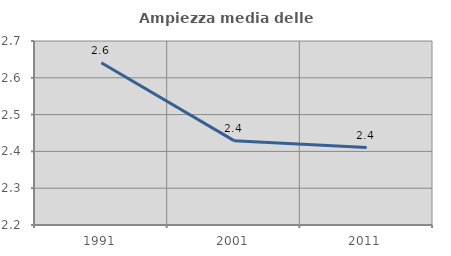
| Category | Ampiezza media delle famiglie |
|---|---|
| 1991.0 | 2.641 |
| 2001.0 | 2.429 |
| 2011.0 | 2.41 |